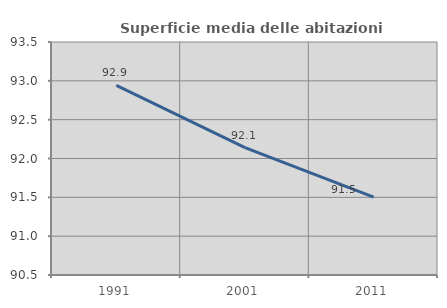
| Category | Superficie media delle abitazioni occupate |
|---|---|
| 1991.0 | 92.942 |
| 2001.0 | 92.14 |
| 2011.0 | 91.503 |